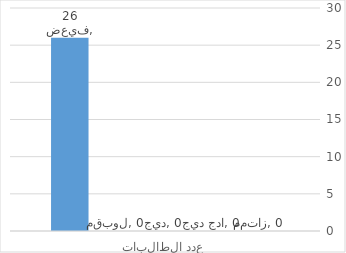
| Category | ممتاز | جيد جدا | جيد | مقبول | ضعيف |
|---|---|---|---|---|---|
| عدد الطالبات | 0 | 0 | 0 | 0 | 26 |